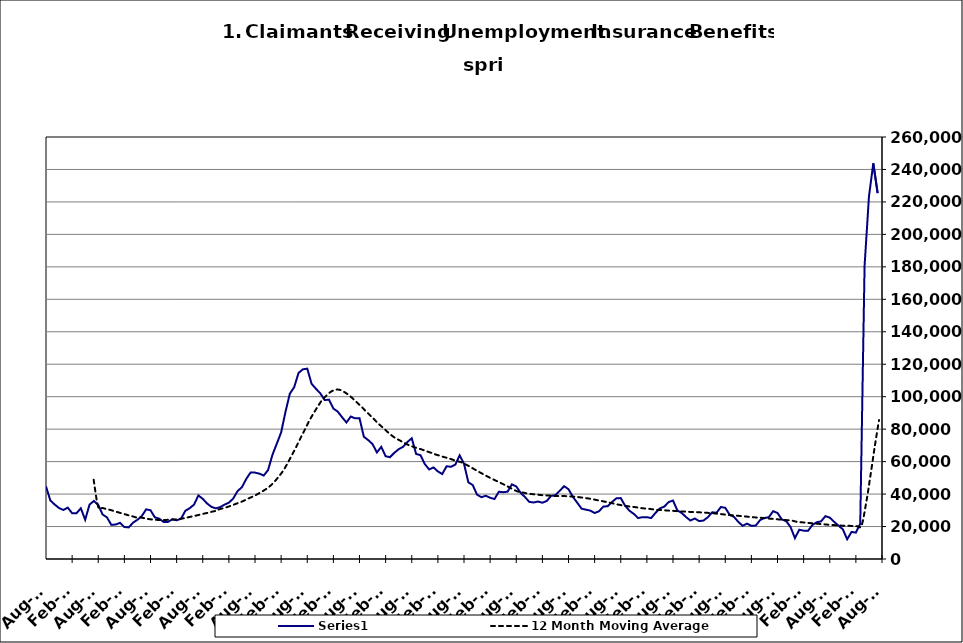
| Category | Series 0 |
|---|---|
| 2000-01-31 | 15239 |
| 2000-02-29 | 13995 |
| 2000-03-31 | 14536 |
| 2000-04-30 | 18337 |
| 2000-05-31 | 20863 |
| 2000-06-30 | 24310 |
| 2000-07-31 | 29359 |
| 2000-08-31 | 29764 |
| 2000-09-30 | 24540 |
| 2000-10-31 | 23067 |
| 2000-11-30 | 21129 |
| 2000-12-31 | 20288 |
| 2001-01-31 | 23646 |
| 2001-02-28 | 23782 |
| 2001-03-31 | 27047 |
| 2001-04-30 | 34048 |
| 2001-05-31 | 38168 |
| 2001-06-30 | 41894 |
| 2001-07-31 | 48114 |
| 2001-08-31 | 47646 |
| 2001-09-30 | 44132 |
| 2001-10-31 | 44465 |
| 2001-11-30 | 45928 |
| 2001-12-31 | 48930 |
| 2002-01-31 | 51864 |
| 2002-02-28 | 50778 |
| 2002-03-31 | 53014 |
| 2002-04-30 | 65394 |
| 2002-05-31 | 67925 |
| 2002-06-30 | 68727 |
| 2002-07-31 | 67269 |
| 2002-08-31 | 64233 |
| 2002-09-30 | 59955 |
| 2002-10-31 | 55535 |
| 2002-11-30 | 52233 |
| 2002-12-31 | 52252 |
| 2003-01-31 | 52694 |
| 2003-02-28 | 52578 |
| 2003-03-31 | 56236 |
| 2003-04-30 | 61020 |
| 2003-05-31 | 60584 |
| 2003-06-30 | 64980 |
| 2003-07-31 | 66426 |
| 2003-08-31 | 65403 |
| 2003-09-30 | 58348 |
| 2003-10-31 | 53953 |
| 2003-11-30 | 50453 |
| 2003-12-31 | 47799 |
| 2004-01-31 | 47134 |
| 2004-02-29 | 42441 |
| 2004-03-31 | 39363 |
| 2004-04-30 | 41157 |
| 2004-05-31 | 40892 |
| 2004-06-30 | 43601 |
| 2004-07-31 | 45411 |
| 2004-08-31 | 44738 |
| 2004-09-30 | 36049 |
| 2004-10-31 | 33551 |
| 2004-11-30 | 31386 |
| 2004-12-31 | 30195 |
| 2005-01-31 | 31661 |
| 2005-02-28 | 28205 |
| 2005-03-31 | 28194 |
| 2005-04-30 | 31233 |
| 2005-05-31 | 24184 |
| 2005-06-30 | 33525 |
| 2005-07-31 | 35776 |
| 2005-08-31 | 33297 |
| 2005-09-30 | 27423 |
| 2005-10-31 | 25647 |
| 2005-11-30 | 21039 |
| 2005-12-31 | 21238 |
| 2006-01-31 | 22270 |
| 2006-02-28 | 19689 |
| 2006-03-31 | 19474 |
| 2006-04-30 | 22420 |
| 2006-05-31 | 24146 |
| 2006-06-30 | 26450 |
| 2006-07-31 | 30575 |
| 2006-08-31 | 30038 |
| 2006-09-30 | 25657 |
| 2006-10-31 | 24869 |
| 2006-11-30 | 22832 |
| 2006-12-31 | 22826 |
| 2007-01-31 | 24459 |
| 2007-02-28 | 23856 |
| 2007-03-31 | 24786 |
| 2007-04-30 | 29690 |
| 2007-05-31 | 31303 |
| 2007-06-30 | 33512 |
| 2007-07-31 | 39176 |
| 2007-08-31 | 37077 |
| 2007-09-30 | 34179 |
| 2007-10-31 | 32130 |
| 2007-11-15 | 31205 |
| 2007-12-15 09:36:00 | 31973 |
| 2008-01-14 19:12:00 | 33494 |
| 2008-02-14 04:48:00 | 34694 |
| 2008-03-15 14:24:00 | 37279 |
| 2008-04-15 | 41840 |
| 2008-05-15 09:36:00 | 44245 |
| 2008-06-14 19:12:00 | 49341 |
| 2008-07-15 04:48:00 | 53353 |
| 2008-08-14 14:24:00 | 53222 |
| 2008-09-14 | 52594 |
| 2008-10-14 09:36:00 | 51417 |
| 2008-11-13 19:12:00 | 54795 |
| 2008-12-14 04:48:00 | 64139 |
| 2009-01-13 14:24:00 | 71026 |
| 2009-02-13 | 77947 |
| 2009-03-15 09:36:00 | 90649 |
| 2009-04-14 19:12:00 | 101865 |
| 2009-05-15 04:48:00 | 105867 |
| 2009-06-14 14:24:00 | 114626 |
| 2009-07-15 | 116882 |
| 2009-08-14 09:36:00 | 117270 |
| 2009-09-13 19:12:00 | 107943 |
| 2009-10-14 04:48:00 | 104849 |
| 2009-11-13 14:24:00 | 102065 |
| 2009-12-14 | 97917 |
| 2010-01-13 09:36:00 | 98175 |
| 2010-02-12 19:12:00 | 92691 |
| 2010-03-15 04:48:00 | 90832 |
| 2010-04-14 14:24:00 | 87347 |
| 2010-05-15 | 84120 |
| 2010-06-14 09:36:00 | 87787 |
| 2010-07-14 19:12:00 | 86654 |
| 2010-08-14 04:48:00 | 86789 |
| 2010-09-13 14:24:00 | 75317 |
| 2010-10-14 | 73259 |
| 2010-11-13 09:36:00 | 70783 |
| 2010-12-13 19:12:00 | 65644 |
| 2011-01-13 04:48:00 | 69106 |
| 2011-02-12 14:24:00 | 63322 |
| 2011-03-15 | 62724 |
| 2011-04-14 09:36:00 | 65434 |
| 2011-05-14 19:12:00 | 67641 |
| 2011-06-14 04:48:00 | 69087 |
| 2011-07-14 14:24:00 | 72082 |
| 2011-08-14 | 74376 |
| 2011-09-13 09:36:00 | 64739 |
| 2011-10-13 19:12:00 | 63965 |
| 2011-11-13 04:48:00 | 58496 |
| 2011-12-13 14:24:00 | 55173 |
| 2012-01-13 | 56418 |
| 2012-02-12 09:36:00 | 53942 |
| 2012-03-13 19:12:00 | 52352 |
| 2012-04-13 04:48:00 | 57118 |
| 2012-05-13 14:24:00 | 56827 |
| 2012-06-13 | 58115 |
| 2012-07-13 09:36:00 | 63863 |
| 2012-08-12 19:12:00 | 58706 |
| 2012-09-12 04:48:00 | 47243 |
| 2012-10-12 14:24:00 | 45567 |
| 2012-11-12 | 39623 |
| 2012-12-12 09:36:00 | 38101 |
| 2013-01-11 19:12:00 | 38966 |
| 2013-02-11 04:48:00 | 37746 |
| 2013-03-13 14:24:00 | 36956 |
| 2013-04-13 | 41439 |
| 2013-05-13 09:36:00 | 41162 |
| 2013-06-12 19:12:00 | 41455 |
| 2013-07-13 04:48:00 | 45989 |
| 2013-08-12 14:24:00 | 44712 |
| 2013-09-12 | 40828 |
| 2013-10-12 09:36:00 | 38185 |
| 2013-11-11 19:12:00 | 35184 |
| 2013-12-12 04:48:00 | 34824 |
| 2014-01-11 14:24:00 | 35396 |
| 2014-02-11 | 34683 |
| 2014-03-13 09:36:00 | 35748 |
| 2014-04-12 19:12:00 | 38892 |
| 2014-05-13 04:48:00 | 39325 |
| 2014-06-12 14:24:00 | 42091 |
| 2014-07-13 | 44842 |
| 2014-08-14 | 43016 |
| 2014-09-13 09:36:00 | 38304 |
| 2014-10-13 19:12:00 | 34708 |
| 2014-11-13 04:48:00 | 31017 |
| 2014-12-13 14:24:00 | 30402 |
| 2015-01-13 | 29823 |
| 2015-02-12 09:36:00 | 28333 |
| 2015-03-14 19:12:00 | 29389 |
| 2015-04-14 04:48:00 | 32293 |
| 2015-05-14 14:24:00 | 32538 |
| 2015-06-14 | 35137 |
| 2015-07-14 09:36:00 | 37398 |
| 2015-08-13 19:12:00 | 37536 |
| 2015-09-13 04:48:00 | 32808 |
| 2015-10-13 14:24:00 | 29728 |
| 2015-11-13 | 27775 |
| 2015-12-13 09:36:00 | 25227 |
| 2016-01-12 19:12:00 | 25773 |
| 2016-02-12 04:48:00 | 25758 |
| 2016-03-13 14:24:00 | 25247 |
| 2016-04-13 | 28463 |
| 2016-05-13 09:36:00 | 31210 |
| 2016-06-12 19:12:00 | 32255 |
| 2016-07-13 04:48:00 | 35088 |
| 2016-08-12 14:24:00 | 36018 |
| 2016-09-12 | 29922 |
| 2016-10-12 09:36:00 | 28368 |
| 2016-11-11 19:12:00 | 25818 |
| 2016-12-12 04:48:00 | 23690 |
| 2017-01-11 14:24:00 | 24964 |
| 2017-02-11 | 23348 |
| 2017-03-13 09:36:00 | 23685 |
| 2017-04-12 19:12:00 | 25733 |
| 2017-05-13 04:48:00 | 28796 |
| 2017-06-12 14:24:00 | 28489 |
| 2017-07-13 | 32034 |
| 2017-08-12 09:36:00 | 31539 |
| 2017-09-11 19:12:00 | 27321 |
| 2017-10-12 04:48:00 | 25990 |
| 2017-11-11 14:24:00 | 22875 |
| 2017-12-12 | 20445 |
| 2018-01-11 09:36:00 | 21794 |
| 2018-02-10 19:12:00 | 20475 |
| 2018-03-13 04:48:00 | 20585 |
| 2018-04-12 14:24:00 | 23969 |
| 2018-05-13 | 25280 |
| 2018-06-12 09:36:00 | 25741 |
| 2018-07-12 19:12:00 | 29479 |
| 2018-08-12 04:48:00 | 28351 |
| 2018-09-11 14:24:00 | 24386 |
| 2018-10-12 | 23292 |
| 2018-11-11 09:36:00 | 19711 |
| 2018-12-11 19:12:00 | 12853 |
| 2019-01-11 04:48:00 | 18039 |
| 2019-02-10 14:24:00 | 17466 |
| 2019-03-13 | 17325 |
| 2019-04-12 09:36:00 | 20890 |
| 2019-05-12 19:12:00 | 22641 |
| 2019-06-12 04:48:00 | 23178 |
| 2019-07-12 14:24:00 | 26385 |
| 2019-08-12 | 25501 |
| 2019-09-11 09:36:00 | 22892 |
| 2019-10-11 19:12:00 | 20585 |
| 2019-11-11 04:48:00 | 18323 |
| 2019-12-11 14:24:00 | 12174 |
| 2020-01-11 | 16683 |
| 2020-02-10 09:36:00 | 16260 |
| 2020-03-11 19:12:00 | 21668 |
| 2020-04-11 04:48:00 | 180666 |
| 2020-05-11 14:24:00 | 223201 |
| 2020-06-11 | 243813 |
| 2020-07-11 09:36:00 | 225474 |
| 2020-08-10 19:12:00 | 233470 |